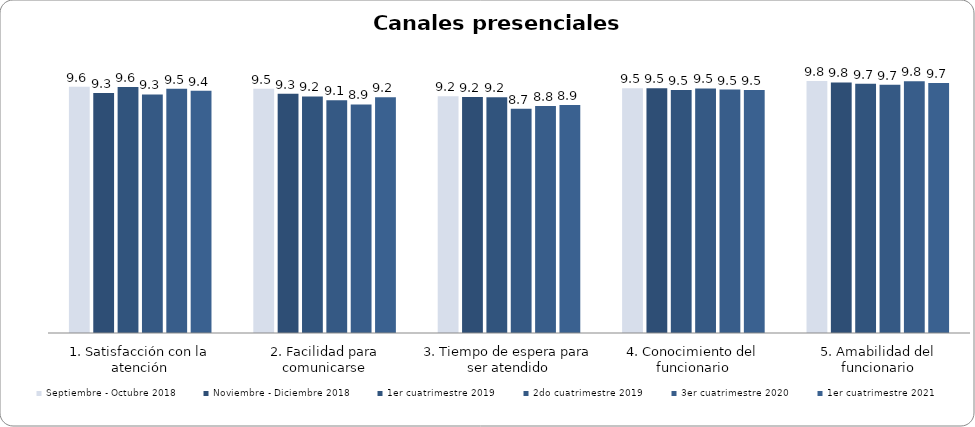
| Category | Septiembre - Octubre 2018 | Noviembre - Diciembre 2018 | 1er cuatrimestre 2019 | 2do cuatrimestre 2019 | 3er cuatrimestre 2020 | 1er cuatrimestre 2021 |
|---|---|---|---|---|---|---|
| 1. Satisfacción con la atención | 9.584 | 9.337 | 9.576 | 9.281 | 9.5 | 9.43 |
| 2. Facilidad para comunicarse | 9.505 | 9.308 | 9.203 | 9.053 | 8.895 | 9.174 |
| 3. Tiempo de espera para ser atendido | 9.208 | 9.183 | 9.169 | 8.728 | 8.833 | 8.876 |
| 4. Conocimiento del funcionario | 9.525 | 9.519 | 9.458 | 9.518 | 9.474 | 9.455 |
| 5. Amabilidad del funcionario | 9.802 | 9.75 | 9.695 | 9.658 | 9.798 | 9.727 |